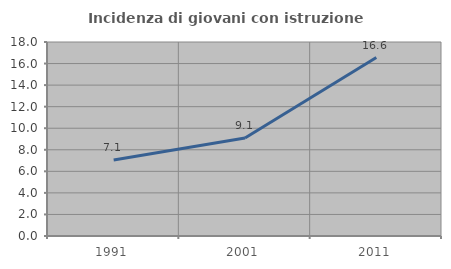
| Category | Incidenza di giovani con istruzione universitaria |
|---|---|
| 1991.0 | 7.059 |
| 2001.0 | 9.091 |
| 2011.0 | 16.561 |